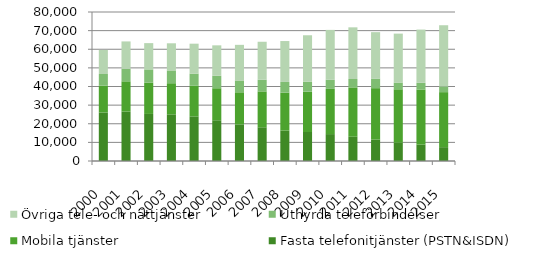
| Category | Fasta telefonitjänster (PSTN&ISDN) | Mobila tjänster | Uthyrda teleförbindelser | Övriga tele- och nättjänster |
|---|---|---|---|---|
| 2000.0 | 26044 | 14407 | 6261 | 12939 |
| 2001.0 | 26537 | 16248 | 6746 | 14673 |
| 2002.0 | 25272 | 16760 | 7147 | 14106 |
| 2003.0 | 25047 | 16709 | 6875 | 14569 |
| 2004.0 | 23957 | 16427 | 6531 | 16073 |
| 2005.0 | 21883 | 17185 | 6692 | 16339 |
| 2006.0 | 19605 | 17288 | 6343 | 19130 |
| 2007.0 | 18116 | 19252 | 6260 | 20396 |
| 2008.0 | 16322 | 20381 | 5742 | 21965 |
| 2009.0 | 15573 | 21661 | 5381 | 24895 |
| 2010.0 | 14442 | 24261 | 4895 | 26798 |
| 2011.0 | 13017 | 26503 | 4516 | 27733 |
| 2012.0 | 11517 | 27590 | 5161.6 | 24911.2 |
| 2013.0 | 9807.503 | 28699.911 | 3619.6 | 26266.886 |
| 2014.0 | 8803 | 29601 | 3579 | 28576 |
| 2015.0 | 7431 | 29542 | 3079 | 32843 |